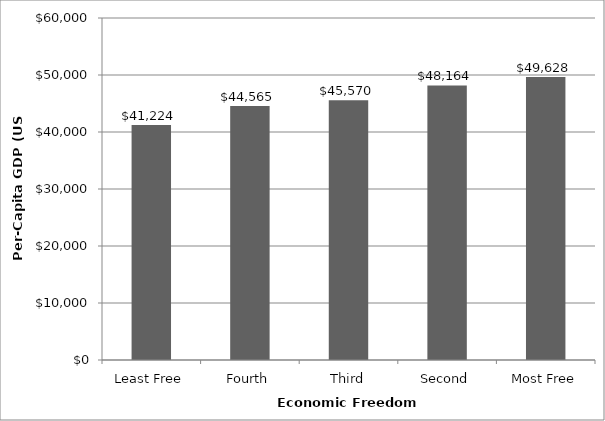
| Category | Series 0 |
|---|---|
| Least Free | 41224.369 |
| Fourth | 44565.274 |
| Third | 45569.733 |
| Second | 48164.32 |
| Most Free | 49628.354 |